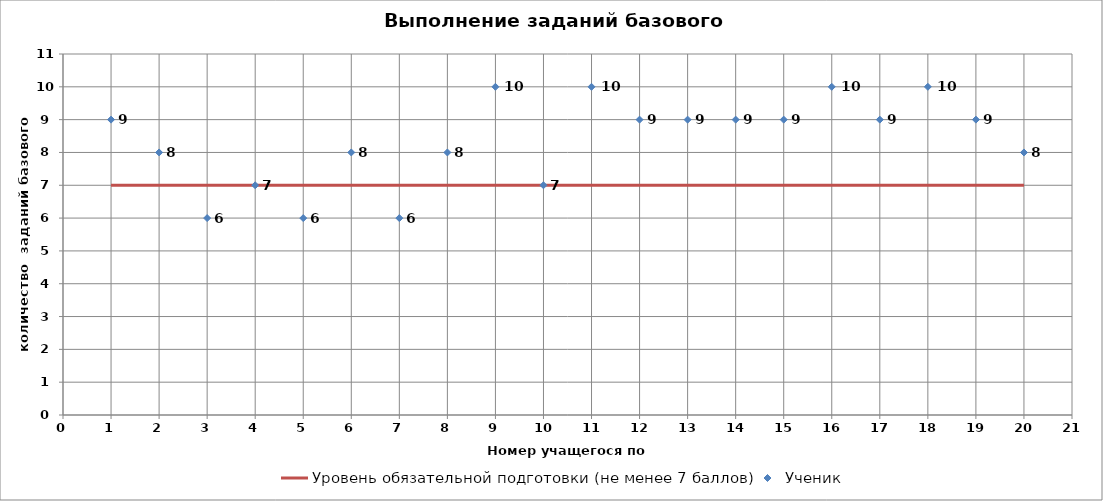
| Category | Уровень обязательной подготовки (не менее 7 баллов) |
|---|---|
| 1.0 | 7 |
| 2.0 | 7 |
| 3.0 | 7 |
| 4.0 | 7 |
| 5.0 | 7 |
| 6.0 | 7 |
| 7.0 | 7 |
| 8.0 | 7 |
| 9.0 | 7 |
| 10.0 | 7 |
| 11.0 | 7 |
| 12.0 | 7 |
| 13.0 | 7 |
| 14.0 | 7 |
| 15.0 | 7 |
| 16.0 | 7 |
| 17.0 | 7 |
| 18.0 | 7 |
| 19.0 | 7 |
| 20.0 | 7 |
| 0.0 | 7 |
| 0.0 | 7 |
| 0.0 | 7 |
| 0.0 | 7 |
| 0.0 | 7 |
| 0.0 | 7 |
| 0.0 | 7 |
| 0.0 | 7 |
| 0.0 | 7 |
| 0.0 | 7 |
| 0.0 | 7 |
| 0.0 | 7 |
| 0.0 | 7 |
| 0.0 | 7 |
| 0.0 | 7 |
| 0.0 | 7 |
| 0.0 | 7 |
| 0.0 | 7 |
| 0.0 | 7 |
| 0.0 | 7 |